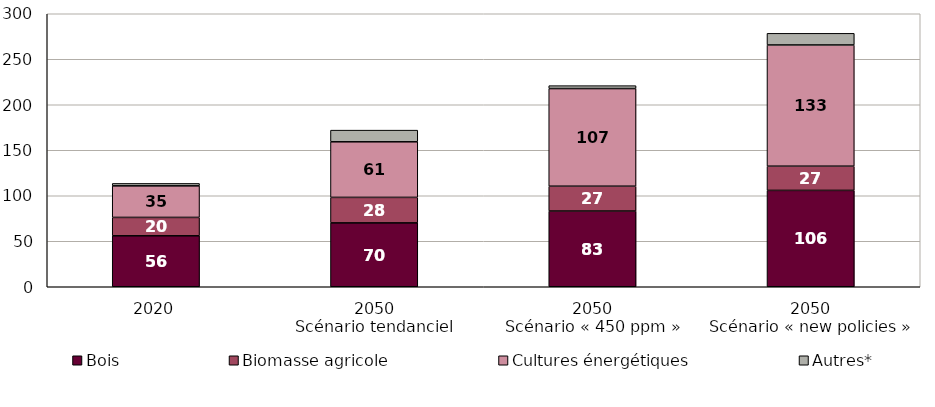
| Category | Bois | Biomasse agricole | Cultures énergétiques | Autres* |
|---|---|---|---|---|
| 2020 | 56 | 20.2 | 34.7 | 2.65 |
| 2050
Scénario tendanciel | 70.2 | 28 | 61.1 | 12.8 |
| 2050
Scénario « 450 ppm » | 83.2 | 27.3 | 107.3 | 3.2 |
| 2050
Scénario « new policies » | 105.9 | 26.6 | 133.2 | 12.8 |